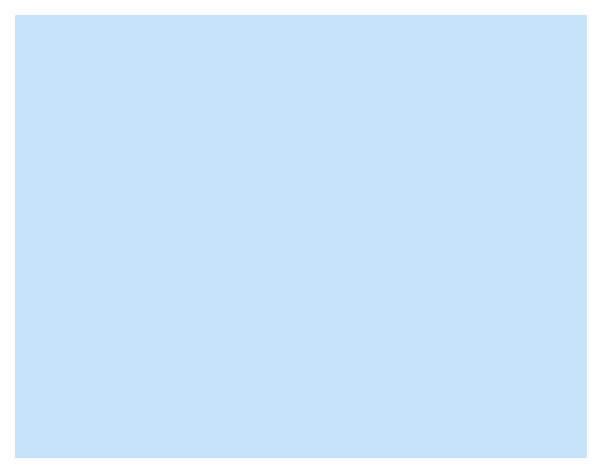
| Category | cover |
|---|---|
| 0 | 1 |